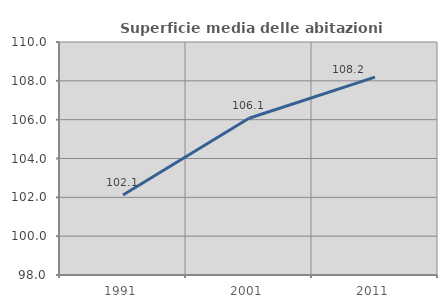
| Category | Superficie media delle abitazioni occupate |
|---|---|
| 1991.0 | 102.116 |
| 2001.0 | 106.073 |
| 2011.0 | 108.188 |